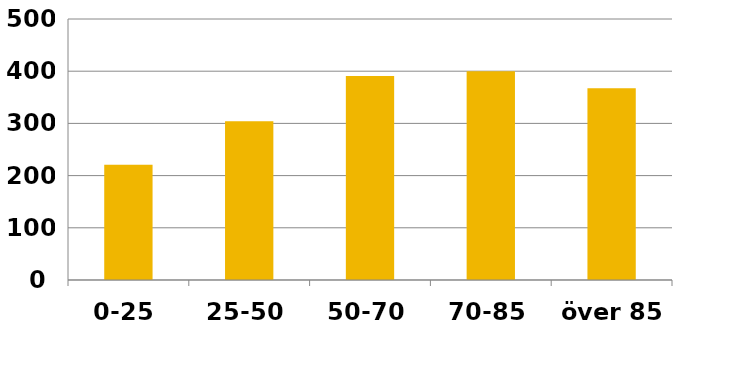
| Category | 2014 |
|---|---|
| 0-25 | 220.959 |
| 25-50 | 304.348 |
| 50-70 | 390.758 |
| 70-85 | 399.689 |
| över 85 | 367.399 |